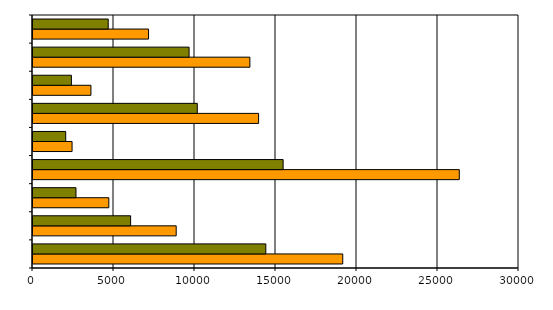
| Category | 2009 | 2008 |
|---|---|---|
| Bez zawodu | 19120 | 14372 |
| Pracownicy przy pracach prostych   | 8839 | 6026 |
| Operatorzy i monterzy maszyn i urządzeń   | 4680 | 2653 |
| Robotnicy przemysłowi i rzemieślnicy   | 26314 | 15440 |
| Rolnicy, ogrodnicy, leśnicy i rybacy   | 2412 | 2020 |
| Pracownicy usług osobistych i sprzedawcy   | 13926 | 10141 |
| Pracownicy biurowi   | 3576 | 2370 |
| Technicy i inny średni personel   | 13388 | 9635 |
| Specjaliści   | 7132 | 4644 |